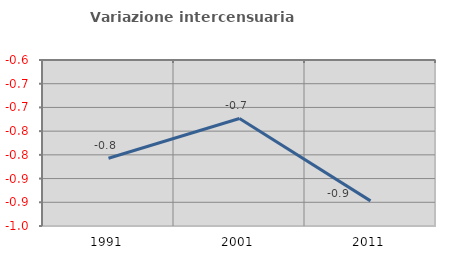
| Category | Variazione intercensuaria annua |
|---|---|
| 1991.0 | -0.807 |
| 2001.0 | -0.723 |
| 2011.0 | -0.897 |